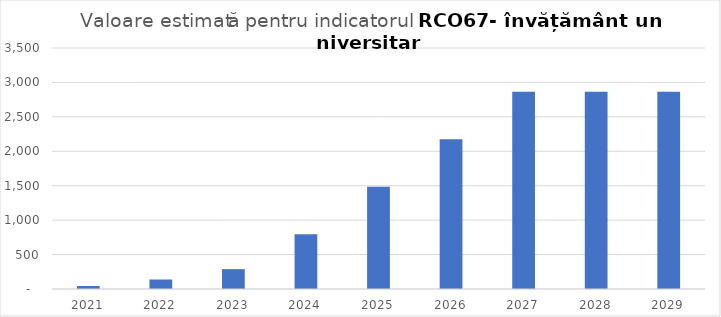
| Category | Series 0 |
|---|---|
| 2021.0 | 43.869 |
| 2022.0 | 137.874 |
| 2023.0 | 288.283 |
| 2024.0 | 795.91 |
| 2025.0 | 1485.282 |
| 2026.0 | 2174.653 |
| 2027.0 | 2864.024 |
| 2028.0 | 2864.024 |
| 2029.0 | 2864.024 |